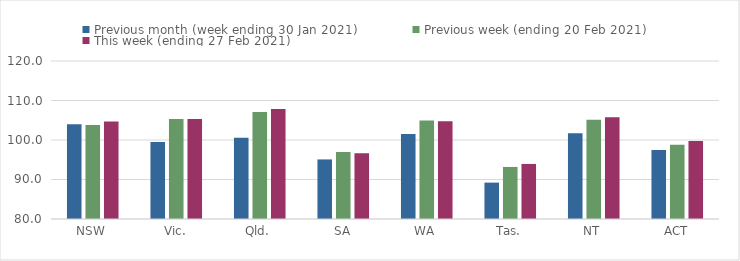
| Category | Previous month (week ending 30 Jan 2021) | Previous week (ending 20 Feb 2021) | This week (ending 27 Feb 2021) |
|---|---|---|---|
| NSW | 103.99 | 103.79 | 104.67 |
| Vic. | 99.48 | 105.32 | 105.32 |
| Qld. | 100.56 | 107.09 | 107.84 |
| SA | 95.08 | 96.97 | 96.66 |
| WA | 101.54 | 104.95 | 104.75 |
| Tas. | 89.21 | 93.18 | 93.94 |
| NT | 101.72 | 105.15 | 105.74 |
| ACT | 97.46 | 98.81 | 99.76 |